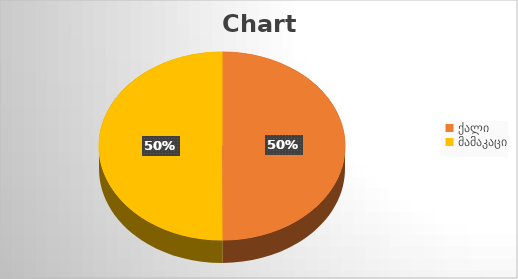
| Category | Series 0 |
|---|---|
| ქალი | 1793 |
| მამაკაცი | 1798 |